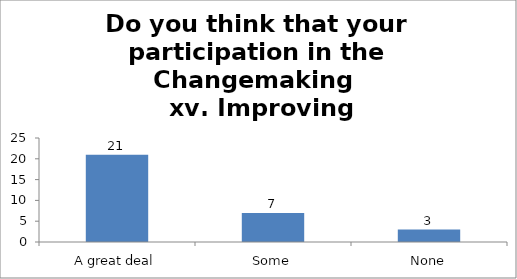
| Category | Do you think that your participation in the Changemaking 
 xv. Improving confidence. |
|---|---|
| A great deal | 21 |
| Some | 7 |
| None | 3 |